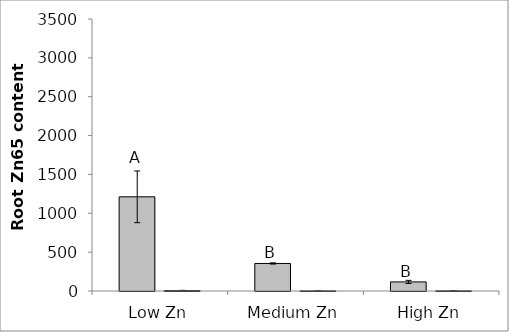
| Category | 76R | rmc |
|---|---|---|
| Low Zn | 1211.949 | 5.672 |
| Medium Zn | 354.344 | 1.041 |
| High Zn | 117.083 | 1.536 |